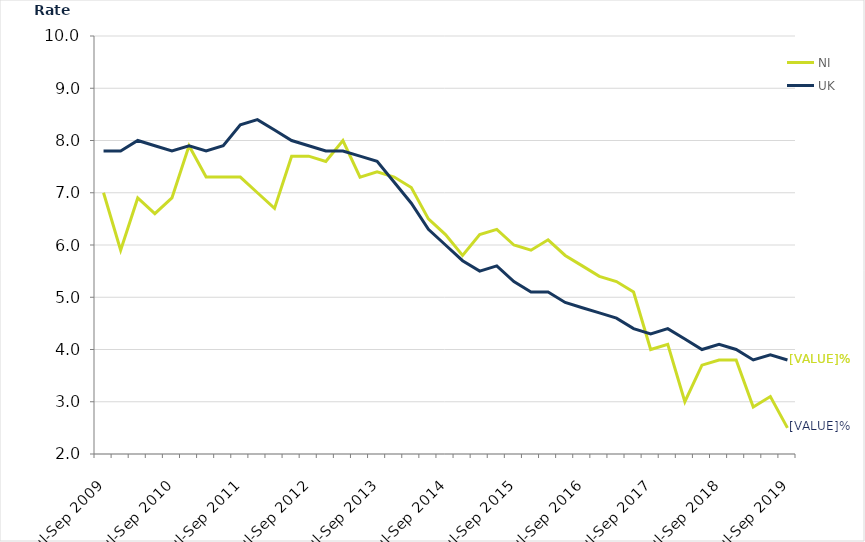
| Category | NI | UK |
|---|---|---|
| Jul-Sep 2009 | 7 | 7.8 |
| Oct-Dec 2009 | 5.9 | 7.8 |
| Jan-Mar 2010 | 6.9 | 8 |
| Apr-Jun 2010 | 6.6 | 7.9 |
| Jul-Sep 2010 | 6.9 | 7.8 |
| Oct-Dec 2010 | 7.9 | 7.9 |
| Jan-Mar 2011 | 7.3 | 7.8 |
| Apr-Jun 2011 | 7.3 | 7.9 |
| Jul-Sep 2011 | 7.3 | 8.3 |
| Oct-Dec 2011 | 7 | 8.4 |
| Jan-Mar 2012 | 6.7 | 8.2 |
| Apr-Jun 2012 | 7.7 | 8 |
| Jul-Sep 2012 | 7.7 | 7.9 |
| Oct-Dec 2012 | 7.6 | 7.8 |
| Jan-Mar 2013 | 8 | 7.8 |
| Apr-Jun 2013 | 7.3 | 7.7 |
| Jul-Sep 2013 | 7.4 | 7.6 |
| Oct-Dec 2013 | 7.3 | 7.2 |
| Jan-Mar 2014 | 7.1 | 6.8 |
| Apr-Jun 2014 | 6.5 | 6.3 |
| Jul-Sep 2014 | 6.2 | 6 |
| Oct-Dec 2014 | 5.8 | 5.7 |
| Jan-Mar 2015 | 6.2 | 5.5 |
| Apr-Jun 2015 | 6.3 | 5.6 |
| Jul-Sep 2015 | 6 | 5.3 |
| Oct-Dec 2015 | 5.9 | 5.1 |
| Jan-Mar 2016 | 6.1 | 5.1 |
| Apr-Jun 2016 | 5.8 | 4.9 |
| Jul-Sep 2016 | 5.6 | 4.8 |
| Oct-Dec 2016 | 5.4 | 4.7 |
| Jan-Mar 2017 | 5.3 | 4.6 |
| Apr-Jun 2017 | 5.1 | 4.4 |
| Jul-Sep 2017 | 4 | 4.3 |
| Oct-Dec 2017 | 4.1 | 4.4 |
| Jan-Mar 2018 | 3 | 4.2 |
| Apr-Jun 2018 | 3.7 | 4 |
| Jul-Sep 2018 | 3.8 | 4.1 |
| Oct-Dec 2018 | 3.8 | 4 |
| Jan-Mar 2019 | 2.9 | 3.8 |
| Apr-Jun 2019 | 3.1 | 3.9 |
| Jul-Sep 2019 | 2.5 | 3.8 |